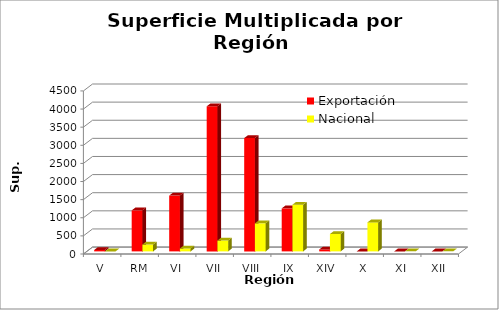
| Category | Exportación | Nacional |
|---|---|---|
| V | 39 | 0 |
| RM | 1132 | 189 |
| VI | 1540 | 80 |
| VII | 4003 | 299 |
| VIII | 3128 | 774 |
| IX | 1187 | 1289 |
| XIV | 53 | 480 |
| X | 0 | 800 |
| XI | 0 | 0.5 |
| XII | 0 | 0.7 |